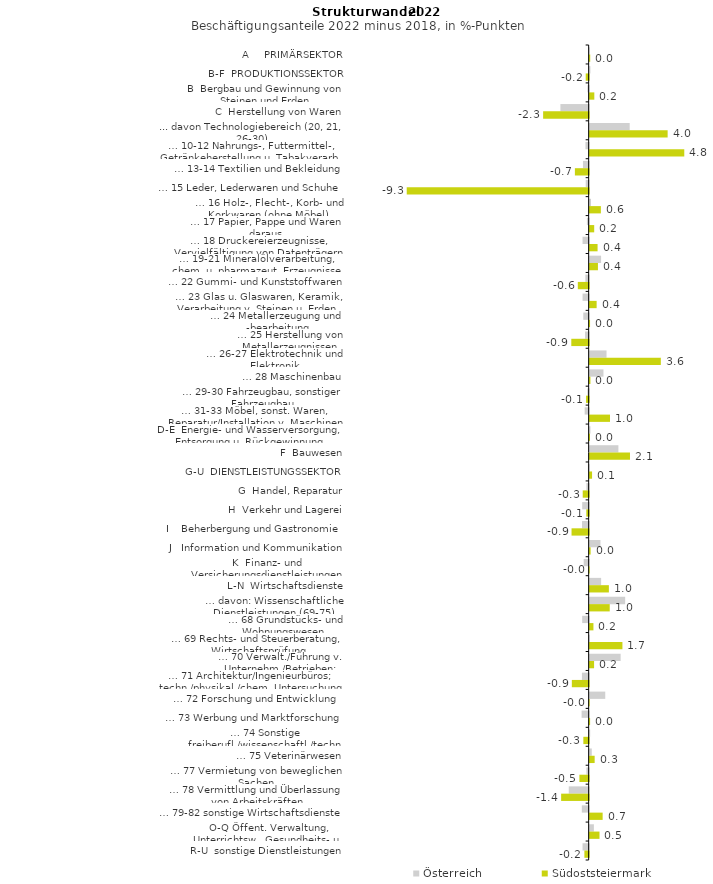
| Category | Österreich | Südoststeiermark |
|---|---|---|
| A     PRIMÄRSEKTOR | 0.004 | 0.028 |
| B-F  PRODUKTIONSSEKTOR | 0.036 | -0.151 |
| B  Bergbau und Gewinnung von Steinen und Erden | -0.063 | 0.238 |
| C  Herstellung von Waren | -1.445 | -2.329 |
| ... davon Technologiebereich (20, 21, 26-30) | 2.047 | 3.987 |
| … 10-12 Nahrungs-, Futtermittel-, Getränkeherstellung u. Tabakverarb. | -0.163 | 4.838 |
| … 13-14 Textilien und Bekleidung | -0.292 | -0.705 |
| … 15 Leder, Lederwaren und Schuhe | -0.15 | -9.303 |
| … 16 Holz-, Flecht-, Korb- und Korkwaren (ohne Möbel)  | 0.068 | 0.573 |
| … 17 Papier, Pappe und Waren daraus  | -0.09 | 0.232 |
| … 18 Druckereierzeugnisse, Vervielfältigung von Datenträgern | -0.314 | 0.404 |
| … 19-21 Mineralölverarbeitung, chem. u. pharmazeut. Erzeugnisse | 0.584 | 0.423 |
| … 22 Gummi- und Kunststoffwaren | -0.168 | -0.555 |
| … 23 Glas u. Glaswaren, Keramik, Verarbeitung v. Steinen u. Erden  | -0.312 | 0.357 |
| … 24 Metallerzeugung und -bearbeitung | -0.276 | 0.02 |
| … 25 Herstellung von Metallerzeugnissen  | -0.185 | -0.888 |
| … 26-27 Elektrotechnik und Elektronik | 0.862 | 3.639 |
| … 28 Maschinenbau | 0.705 | 0.039 |
| … 29-30 Fahrzeugbau, sonstiger Fahrzeugbau | -0.066 | -0.133 |
| … 31-33 Möbel, sonst. Waren, Reparatur/Installation v. Maschinen | -0.204 | 1.04 |
| D-E  Energie- und Wasserversorgung, Entsorgung u. Rückgewinnung | 0.038 | 0.018 |
| F  Bauwesen | 1.469 | 2.062 |
| G-U  DIENSTLEISTUNGSSEKTOR | -0.04 | 0.122 |
| G  Handel, Reparatur | -0.115 | -0.304 |
| H  Verkehr und Lagerei | -0.33 | -0.12 |
| I    Beherbergung und Gastronomie | -0.34 | -0.876 |
| J   Information und Kommunikation | 0.551 | 0.049 |
| K  Finanz- und Versicherungsdienstleistungen | -0.255 | -0.014 |
| L-N  Wirtschaftsdienste | 0.586 | 0.982 |
| … davon: Wissenschaftliche Dienstleistungen (69-75) | 1.815 | 1.026 |
| … 68 Grundstücks- und Wohnungswesen  | -0.331 | 0.193 |
| … 69 Rechts- und Steuerberatung, Wirtschaftsprüfung | 0.008 | 1.675 |
| … 70 Verwalt./Führung v. Unternehm./Betrieben; Unternehmensberat. | 1.583 | 0.226 |
| … 71 Architektur/Ingenieurbüros; techn./physikal./chem. Untersuchung | -0.344 | -0.861 |
| … 72 Forschung und Entwicklung  | 0.797 | -0.01 |
| … 73 Werbung und Marktforschung | -0.361 | 0.022 |
| … 74 Sonstige freiberufl./wissenschaftl./techn. Tätigkeiten | 0.025 | -0.273 |
| … 75 Veterinärwesen | 0.108 | 0.255 |
| … 77 Vermietung von beweglichen Sachen  | -0.116 | -0.474 |
| … 78 Vermittlung und Überlassung von Arbeitskräften | -1.018 | -1.408 |
| … 79-82 sonstige Wirtschaftsdienste | -0.351 | 0.664 |
| O-Q Öffent. Verwaltung, Unterrichtsw., Gesundheits- u. Sozialwesen | 0.216 | 0.503 |
| R-U  sonstige Dienstleistungen | -0.314 | -0.219 |